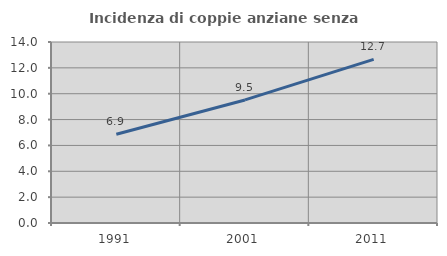
| Category | Incidenza di coppie anziane senza figli  |
|---|---|
| 1991.0 | 6.86 |
| 2001.0 | 9.519 |
| 2011.0 | 12.654 |